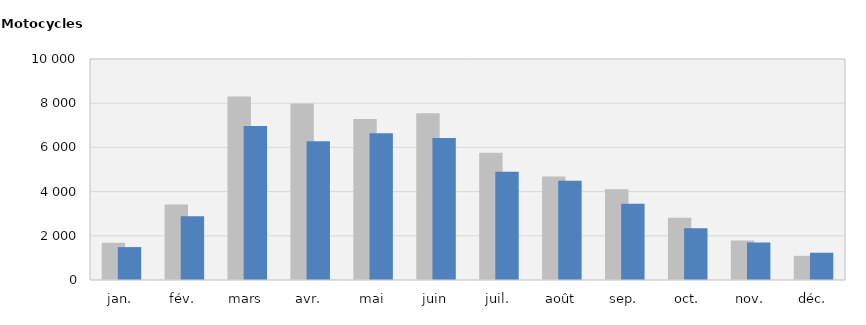
| Category | 2021 | 2022 |
|---|---|---|
| jan. | 1687 | 1489 |
| fév. | 3421 | 2884 |
| mars | 8299 | 6971 |
| avr. | 7990 | 6275 |
| mai | 7284 | 6642 |
| juin | 7541 | 6425 |
| juil. | 5759 | 4902 |
| août | 4683 | 4492 |
| sep. | 4110 | 3448 |
| oct. | 2817 | 2337 |
| nov. | 1784 | 1700 |
| déc. | 1093 | 1234 |